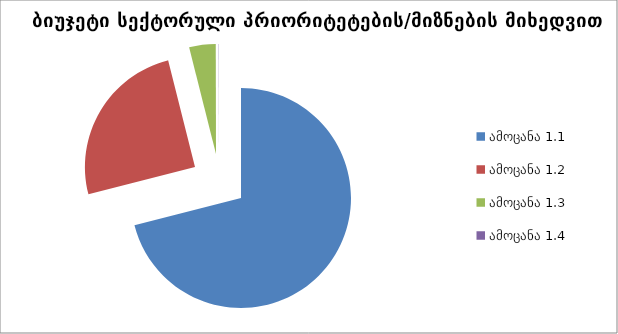
| Category | სულ |
|---|---|
| ამოცანა 1.1 | 62748999 |
| ამოცანა 1.2 | 22156300 |
| ამოცანა 1.3 | 3441951.026 |
| ამოცანა 1.4 | 32000 |